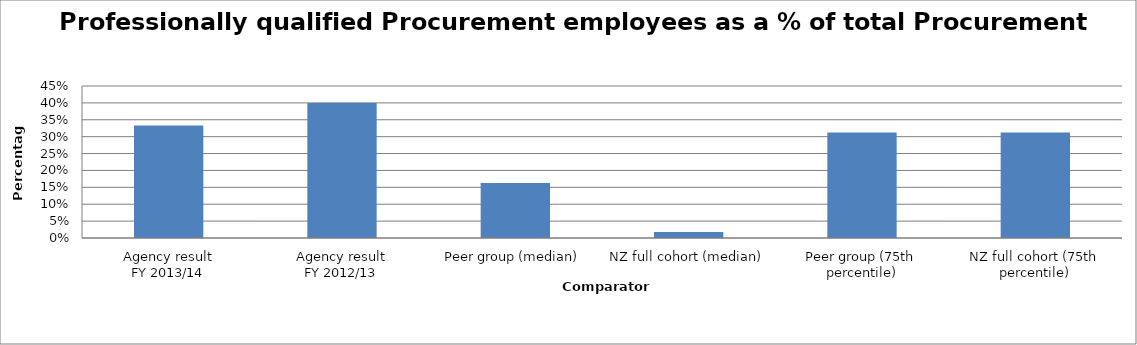
| Category | Series 0 |
|---|---|
| Agency result
FY 2013/14 | 0.333 |
| Agency result
FY 2012/13 | 0.4 |
| Peer group (median) | 0.162 |
| NZ full cohort (median) | 0.018 |
| Peer group (75th percentile) | 0.312 |
| NZ full cohort (75th percentile) | 0.312 |